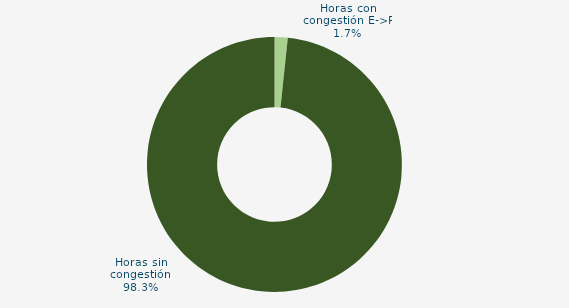
| Category | Horas con congestión E->P |
|---|---|
| Horas con congestión E->P | 1.667 |
| Horas con congestión P->E | 0 |
| Horas sin congestión | 98.333 |